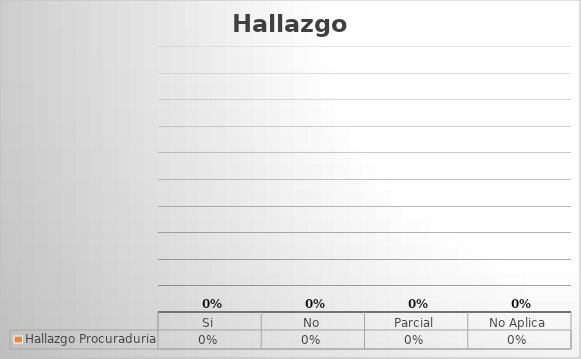
| Category | Hallazgo Procuraduria |
|---|---|
| Si | 0 |
| No | 0 |
| Parcial | 0 |
| No Aplica | 0 |